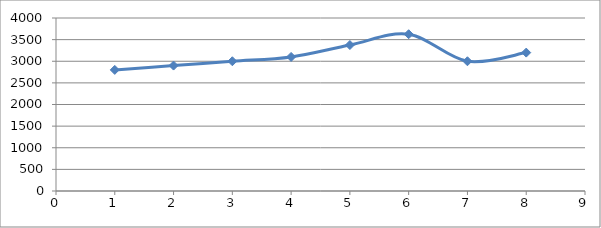
| Category | Series 0 |
|---|---|
| 1.0 | 2800 |
| 2.0 | 2900 |
| 3.0 | 3000 |
| 4.0 | 3100 |
| 5.0 | 3375 |
| 6.0 | 3625 |
| 7.0 | 3000 |
| 8.0 | 3200 |